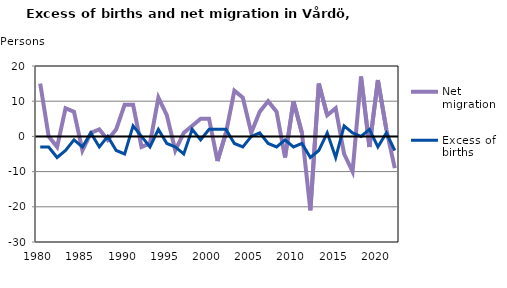
| Category | Net migration | Excess of births |
|---|---|---|
| 1980.0 | 15 | -3 |
| 1981.0 | 0 | -3 |
| 1982.0 | -3 | -6 |
| 1983.0 | 8 | -4 |
| 1984.0 | 7 | -1 |
| 1985.0 | -4 | -3 |
| 1986.0 | 1 | 1 |
| 1987.0 | 2 | -3 |
| 1988.0 | -1 | 0 |
| 1989.0 | 2 | -4 |
| 1990.0 | 9 | -5 |
| 1991.0 | 9 | 3 |
| 1992.0 | -3 | 0 |
| 1993.0 | -2 | -3 |
| 1994.0 | 11 | 2 |
| 1995.0 | 6 | -2 |
| 1996.0 | -4 | -3 |
| 1997.0 | 1 | -5 |
| 1998.0 | 3 | 2 |
| 1999.0 | 5 | -1 |
| 2000.0 | 5 | 2 |
| 2001.0 | -7 | 2 |
| 2002.0 | 1 | 2 |
| 2003.0 | 13 | -2 |
| 2004.0 | 11 | -3 |
| 2005.0 | 1 | 0 |
| 2006.0 | 7 | 1 |
| 2007.0 | 10 | -2 |
| 2008.0 | 7 | -3 |
| 2009.0 | -6 | -1 |
| 2010.0 | 10 | -3 |
| 2011.0 | 1 | -2 |
| 2012.0 | -21 | -6 |
| 2013.0 | 15 | -4 |
| 2014.0 | 6 | 1 |
| 2015.0 | 8 | -6 |
| 2016.0 | -5 | 3 |
| 2017.0 | -10 | 1 |
| 2018.0 | 17 | 0 |
| 2019.0 | -3 | 2 |
| 2020.0 | 16 | -3 |
| 2021.0 | 2 | 1 |
| 2022.0 | -9 | -4 |